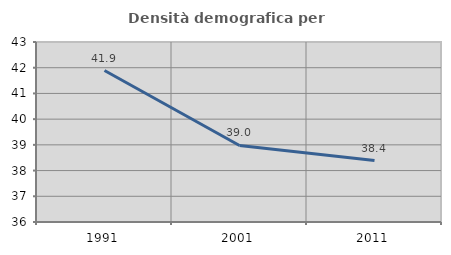
| Category | Densità demografica |
|---|---|
| 1991.0 | 41.89 |
| 2001.0 | 38.976 |
| 2011.0 | 38.388 |